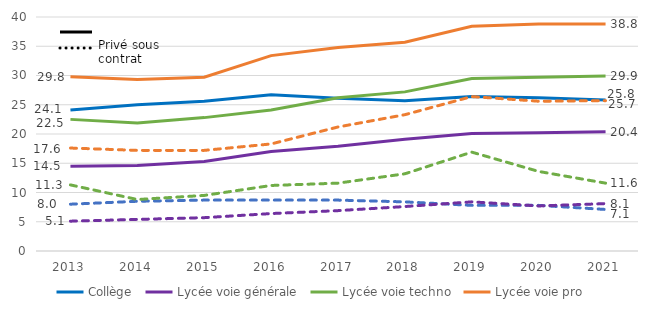
| Category | type | Collège | Lycée voie générale | Lycée voie techno | Lycée voie pro |
|---|---|---|---|---|---|
| 2013 | 8 | 5.1 | 11.3 | 17.6 | 29.8 |
| 2014 | 8.5 | 5.4 | 8.8 | 17.2 | 29.3 |
| 2015 | 8.7 | 5.7 | 9.5 | 17.2 | 29.7 |
| 2016 | 8.7 | 6.4 | 11.2 | 18.3 | 33.4 |
| 2017 | 8.7 | 6.9 | 11.6 | 21.2 | 34.8 |
| 2018 | 8.4 | 7.6 | 13.2 | 23.3 | 35.7 |
| 2019 | 7.8 | 8.4 | 16.9 | 26.4 | 38.4 |
| 2020 | 7.8 | 7.7 | 13.6 | 25.6 | 38.8 |
| 2021 | 7.1 | 8.1 | 11.6 | 25.7 | 38.8 |